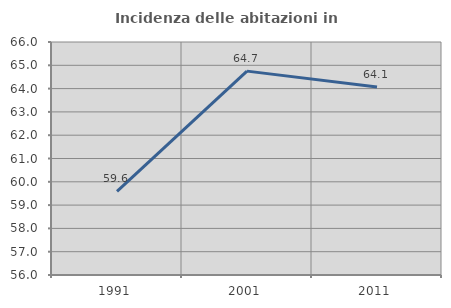
| Category | Incidenza delle abitazioni in proprietà  |
|---|---|
| 1991.0 | 59.586 |
| 2001.0 | 64.75 |
| 2011.0 | 64.071 |